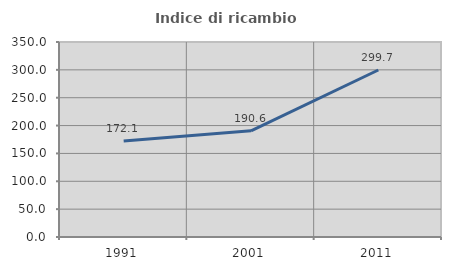
| Category | Indice di ricambio occupazionale  |
|---|---|
| 1991.0 | 172.135 |
| 2001.0 | 190.632 |
| 2011.0 | 299.712 |